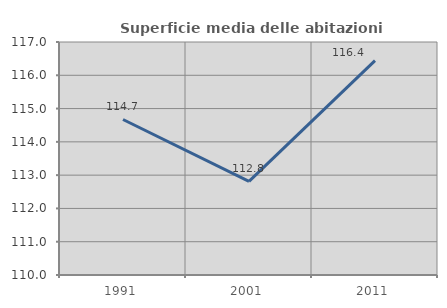
| Category | Superficie media delle abitazioni occupate |
|---|---|
| 1991.0 | 114.672 |
| 2001.0 | 112.813 |
| 2011.0 | 116.442 |